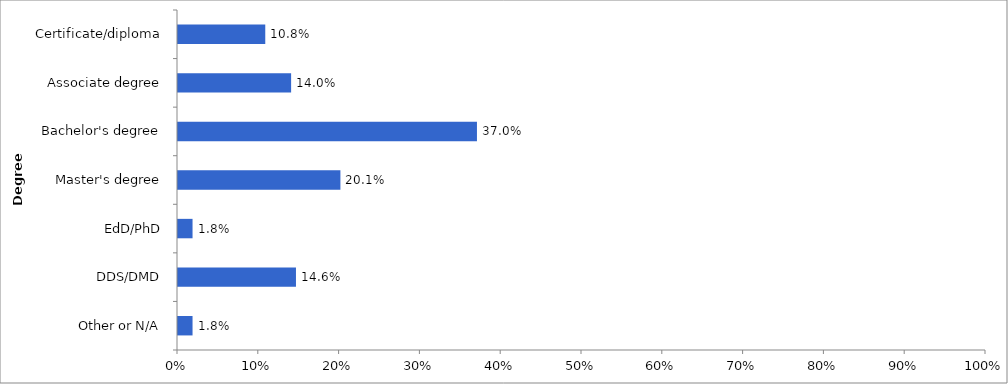
| Category | Series 0 |
|---|---|
| Other or N/A | 0.018 |
| DDS/DMD | 0.146 |
| EdD/PhD | 0.018 |
| Master's degree | 0.201 |
| Bachelor's degree | 0.37 |
| Associate degree | 0.14 |
| Certificate/diploma | 0.108 |